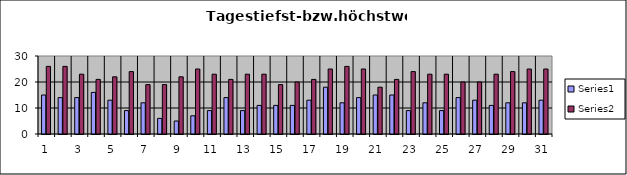
| Category | Series 0 | Series 1 |
|---|---|---|
| 0 | 15 | 26 |
| 1 | 14 | 26 |
| 2 | 14 | 23 |
| 3 | 16 | 21 |
| 4 | 13 | 22 |
| 5 | 9 | 24 |
| 6 | 12 | 19 |
| 7 | 6 | 19 |
| 8 | 5 | 22 |
| 9 | 7 | 25 |
| 10 | 9 | 23 |
| 11 | 14 | 21 |
| 12 | 9 | 23 |
| 13 | 11 | 23 |
| 14 | 11 | 19 |
| 15 | 11 | 20 |
| 16 | 13 | 21 |
| 17 | 18 | 25 |
| 18 | 12 | 26 |
| 19 | 14 | 25 |
| 20 | 15 | 18 |
| 21 | 15 | 21 |
| 22 | 9 | 24 |
| 23 | 12 | 23 |
| 24 | 9 | 23 |
| 25 | 14 | 20 |
| 26 | 13 | 20 |
| 27 | 11 | 23 |
| 28 | 12 | 24 |
| 29 | 12 | 25 |
| 30 | 13 | 25 |